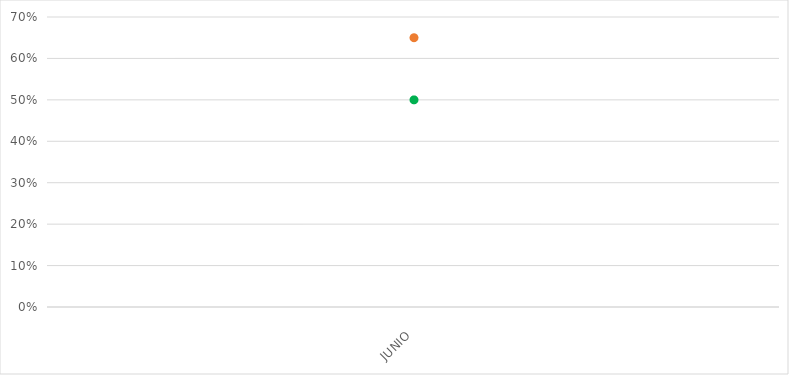
| Category | VALOR  | META PONDERADA |
|---|---|---|
| JUNIO | 0.65 | 0.5 |